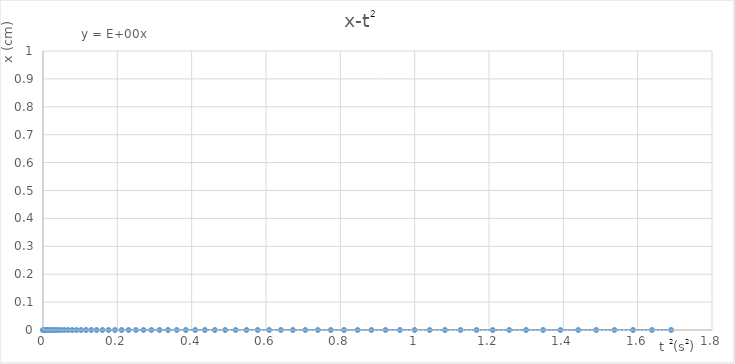
| Category | t2 |
|---|---|
| 0.0 | 0 |
| 0.0004 | 0 |
| 0.0016 | 0 |
| 0.0036 | 0 |
| 0.0064 | 0 |
| 0.010000000000000002 | 0 |
| 0.014400000000000003 | 0 |
| 0.019600000000000003 | 0 |
| 0.0256 | 0 |
| 0.0324 | 0 |
| 0.039999999999999994 | 0 |
| 0.04839999999999999 | 0 |
| 0.057599999999999985 | 0 |
| 0.06759999999999998 | 0 |
| 0.07839999999999998 | 0 |
| 0.09 | 0 |
| 0.1024 | 0 |
| 0.11560000000000002 | 0 |
| 0.12960000000000002 | 0 |
| 0.14440000000000006 | 0 |
| 0.16000000000000006 | 0 |
| 0.17640000000000008 | 0 |
| 0.1936000000000001 | 0 |
| 0.21160000000000012 | 0 |
| 0.23040000000000013 | 0 |
| 0.2500000000000001 | 0 |
| 0.27040000000000014 | 0 |
| 0.29160000000000014 | 0 |
| 0.31360000000000016 | 0 |
| 0.3364000000000002 | 0 |
| 0.36000000000000026 | 0 |
| 0.3844000000000003 | 0 |
| 0.4096000000000003 | 0 |
| 0.4356000000000003 | 0 |
| 0.46240000000000037 | 0 |
| 0.4900000000000004 | 0 |
| 0.5184000000000004 | 0 |
| 0.5476000000000005 | 0 |
| 0.5776000000000006 | 0 |
| 0.6084000000000006 | 0 |
| 0.6400000000000006 | 0 |
| 0.6724000000000007 | 0 |
| 0.7056000000000007 | 0 |
| 0.7396000000000007 | 0 |
| 0.7744000000000008 | 0 |
| 0.8100000000000008 | 0 |
| 0.8464000000000009 | 0 |
| 0.8836000000000009 | 0 |
| 0.921600000000001 | 0 |
| 0.960400000000001 | 0 |
| 1.0000000000000009 | 0 |
| 1.0404000000000009 | 0 |
| 1.081600000000001 | 0 |
| 1.123600000000001 | 0 |
| 1.1664000000000012 | 0 |
| 1.210000000000001 | 0 |
| 1.2544000000000013 | 0 |
| 1.2996000000000012 | 0 |
| 1.3456000000000015 | 0 |
| 1.3924000000000014 | 0 |
| 1.4400000000000015 | 0 |
| 1.4884000000000015 | 0 |
| 1.5376000000000016 | 0 |
| 1.5876000000000017 | 0 |
| 1.6384000000000019 | 0 |
| 1.690000000000002 | 0 |